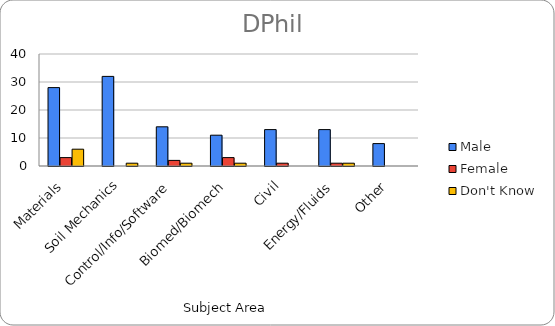
| Category | Male | Female | Don't Know |
|---|---|---|---|
| Materials | 28 | 3 | 6 |
| Soil Mechanics | 32 | 0 | 1 |
| Control/Info/Software | 14 | 2 | 1 |
| Biomed/Biomech | 11 | 3 | 1 |
| Civil | 13 | 1 | 0 |
| Energy/Fluids | 13 | 1 | 1 |
| Other | 8 | 0 | 0 |